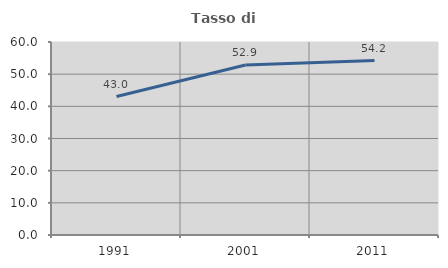
| Category | Tasso di occupazione   |
|---|---|
| 1991.0 | 43.035 |
| 2001.0 | 52.863 |
| 2011.0 | 54.248 |